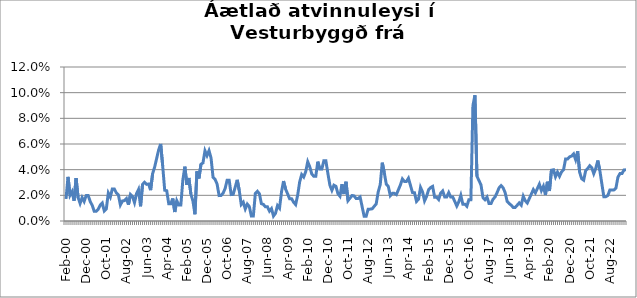
| Category | Series 0 |
|---|---|
| Feb-00 | 0.017 |
| Mar-00 | 0.034 |
| Apr-00 | 0.02 |
| May-00 | 0.023 |
| Jun-00 | 0.016 |
| Jul-00 | 0.033 |
| Aug-00 | 0.018 |
| Sep-00 | 0.014 |
| Oct-00 | 0.018 |
| Nov-00 | 0.015 |
| Dec-00 | 0.02 |
| Jan-01 | 0.02 |
| Feb-01 | 0.015 |
| Mar-01 | 0.012 |
| Apr-01 | 0.008 |
| May-01 | 0.008 |
| Jun-01 | 0.009 |
| Jul-01 | 0.012 |
| Aug-01 | 0.014 |
| Sep-01 | 0.008 |
| Oct-01 | 0.009 |
| Nov-01 | 0.022 |
| Dec-01 | 0.019 |
| Jan-02 | 0.025 |
| Feb-02 | 0.025 |
| Mar-02 | 0.022 |
| Apr-02 | 0.02 |
| May-02 | 0.012 |
| Jun-02 | 0.016 |
| Jul-02 | 0.016 |
| Aug-02 | 0.017 |
| Sep-02 | 0.013 |
| Oct-02 | 0.021 |
| Nov-02 | 0.019 |
| Dec-02 | 0.014 |
| Jan-03 | 0.021 |
| Feb-03 | 0.025 |
| Mar-03 | 0.011 |
| Apr-03 | 0.029 |
| May-03 | 0.03 |
| Jun-03 | 0.029 |
| Jul-03 | 0.029 |
| Aug-03 | 0.024 |
| Sep-03 | 0.037 |
| Oct-03 | 0.042 |
| Nov-03 | 0.049 |
| Dec-03 | 0.055 |
| Jan-04 | 0.06 |
| Feb-04 | 0.043 |
| Mar-04 | 0.024 |
| Apr-04 | 0.024 |
| May-04 | 0.013 |
| Jun-04 | 0.013 |
| Jul-04 | 0.018 |
| Aug-04 | 0.007 |
| Sep-04 | 0.016 |
| Oct-04 | 0.012 |
| Nov-04 | 0.012 |
| Dec-04 | 0.032 |
| Jan-05 | 0.042 |
| Feb-05 | 0.028 |
| Mar-05 | 0.034 |
| Apr-05 | 0.021 |
| May-05 | 0.016 |
| Jun-05 | 0.005 |
| Jul-05 | 0.039 |
| Aug-05 | 0.033 |
| Sep-05 | 0.044 |
| Oct-05 | 0.045 |
| Nov-05 | 0.055 |
| Dec-05 | 0.051 |
| Jan-06 | 0.055 |
| Feb-06 | 0.049 |
| Mar-06 | 0.034 |
| Apr-06 | 0.032 |
| May-06 | 0.029 |
| Jun-06 | 0.02 |
| Jul-06 | 0.02 |
| Aug-06 | 0.022 |
| Sep-06 | 0.025 |
| Oct-06 | 0.032 |
| Nov-06 | 0.032 |
| Dec-06 | 0.021 |
| Jan-07 | 0.021 |
| Feb-07 | 0.026 |
| Mar-07 | 0.032 |
| Apr-07 | 0.024 |
| May-07 | 0.013 |
| Jun-07 | 0.015 |
| Jul-07 | 0.009 |
| Aug-07 | 0.013 |
| Sep-07 | 0.011 |
| Oct-07 | 0.004 |
| Nov-07 | 0.004 |
| Dec-07 | 0.022 |
| Jan-08 | 0.023 |
| Feb-08 | 0.021 |
| Mar-08 | 0.014 |
| Apr-08 | 0.013 |
| May-08 | 0.011 |
| Jun-08 | 0.011 |
| Jul-08 | 0.008 |
| Aug-08 | 0.01 |
| Sep-08 | 0.004 |
| Oct-08 | 0.006 |
| Nov-08 | 0.012 |
| Dec-08 | 0.01 |
| Jan-09 | 0.023 |
| Feb-09 | 0.031 |
| Mar-09 | 0.025 |
| Apr-09 | 0.021 |
| May-09 | 0.017 |
| Jun-09 | 0.017 |
| Jul-09 | 0.015 |
| Aug-09 | 0.013 |
| Sep-09 | 0.02 |
| Oct-09 | 0.03 |
| Nov-09 | 0.036 |
| Dec-09 | 0.034 |
| Jan-10 | 0.038 |
| Feb-10 | 0.046 |
| Mar-10 | 0.042 |
| Apr-10 | 0.037 |
| May-10 | 0.035 |
| Jun-10 | 0.035 |
| Jul-10 | 0.046 |
| Aug-10 | 0.04 |
| Sep-10 | 0.04 |
| Oct-10 | 0.047 |
| Nov-10 | 0.047 |
| Dec-10 | 0.037 |
| Jan-11 | 0.028 |
| Feb-11 | 0.024 |
| Mar-11 | 0.028 |
| Apr-11 | 0.027 |
| May-11 | 0.021 |
| Jun-11 | 0.019 |
| Jul-11 | 0.029 |
| Aug-11 | 0.021 |
| Sep-11 | 0.031 |
| Oct-11 | 0.016 |
| Nov-11 | 0.018 |
| Dec-11 | 0.02 |
| Jan-12 | 0.02 |
| Feb-12 | 0.018 |
| Mar-12 | 0.018 |
| Apr-12 | 0.019 |
| May-12 | 0.011 |
| Jun-12 | 0.004 |
| Jul-12 | 0.004 |
| Aug-12 | 0.009 |
| Sep-12 | 0.009 |
| Oct-12 | 0.01 |
| Nov-12 | 0.011 |
| Dec-12 | 0.013 |
| Jan-13 | 0.023 |
| Feb-13 | 0.028 |
| Mar-13 | 0.045 |
| Apr-13 | 0.038 |
| May-13 | 0.029 |
| Jun-13 | 0.027 |
| Jul-13 | 0.02 |
| Aug-13 | 0.022 |
| Sep-13 | 0.022 |
| Oct-13 | 0.021 |
| Nov-13 | 0.024 |
| Dec-13 | 0.028 |
| jan..14 | 0.033 |
| Feb-14 | 0.031 |
| Mar-14 | 0.031 |
| Apr-14 | 0.033 |
| May-14 | 0.028 |
| Jun-14 | 0.022 |
| Jul-14 | 0.022 |
| Aug-14 | 0.015 |
| Sep-14 | 0.017 |
| Oct-14 | 0.026 |
| Nov-14 | 0.023 |
| Dec-14 | 0.016 |
| Jan-15 | 0.019 |
| Feb-15 | 0.024 |
| Mar-15 | 0.026 |
| Apr-15 | 0.027 |
| May-15 | 0.019 |
| Jun-15 | 0.019 |
| Jul-15 | 0.017 |
| Aug-15 | 0.022 |
| Sep-15 | 0.023 |
| Oct-15 | 0.019 |
| Nov-15 | 0.019 |
| Dec-15 | 0.022 |
| Jan-16 | 0.019 |
| Feb-16 | 0.019 |
| Mar-16 | 0.015 |
| Apr-16 | 0.012 |
| May-16 | 0.015 |
| Jun-16 | 0.02 |
| Jul-16 | 0.013 |
| Aug-16 | 0.013 |
| Sep-16 | 0.011 |
| Oct-16 | 0.017 |
| Nov-16 | 0.017 |
| Dec-16 | 0.09 |
| Jan-17 | 0.098 |
| Feb-17 | 0.035 |
| Mar-17 | 0.032 |
| Apr-17 | 0.028 |
| May-17 | 0.018 |
| Jun-17 | 0.017 |
| Jul-17 | 0.019 |
| Aug-17 | 0.014 |
| Sep-17 | 0.014 |
| Oct-17 | 0.017 |
| Nov-17 | 0.019 |
| Dec-17 | 0.022 |
| Jan-18 | 0.026 |
| Feb-18 | 0.028 |
| Mar-18 | 0.026 |
| Apr-18 | 0.022 |
| May-18 | 0.015 |
| Jun-18 | 0.014 |
| Jul-18 | 0.012 |
| Aug-18 | 0.011 |
| Sep-18 | 0.011 |
| Oct-18 | 0.012 |
| Nov-18 | 0.014 |
| Dec-18 | 0.012 |
| Jan-19 | 0.019 |
| Feb-19 | 0.016 |
| Mar-19 | 0.014 |
| Apr-19 | 0.017 |
| May-19 | 0.021 |
| Jun-19 | 0.024 |
| Jul-19 | 0.022 |
| Aug-19 | 0.025 |
| Sep-19 | 0.029 |
| Oct-19 | 0.024 |
| Nov-19 | 0.027 |
| Dec-19 | 0.02 |
| Jan-20 | 0.031 |
| Feb-20 | 0.023 |
| Mar-20 | 0.04 |
| Apr-20 | 0.04 |
| May-20 | 0.034 |
| Jun-20 | 0.038 |
| Jul-20 | 0.035 |
| Aug-20 | 0.038 |
| Sep-20 | 0.04 |
| Oct-20 | 0.048 |
| Nov-20 | 0.048 |
| Dec-20 | 0.05 |
| Jan-21 | 0.051 |
| Feb-21 | 0.052 |
| Mar-21 | 0.048 |
| Apr-21 | 0.054 |
| May-21 | 0.038 |
| Jun-21 | 0.033 |
| Jul-21 | 0.032 |
| Aug-21 | 0.039 |
| Sep-21 | 0.041 |
| Oct-21 | 0.043 |
| Nov-21 | 0.042 |
| Dec-21 | 0.037 |
| Jan-22 | 0.041 |
| Feb-22 | 0.047 |
| Mar-22 | 0.04 |
| Apr-22 | 0.029 |
| May-22 | 0.019 |
| Jun-22 | 0.019 |
| Jul-22 | 0.02 |
| Aug-22 | 0.024 |
| Sep-22 | 0.024 |
| Oct-22 | 0.024 |
| Nov-22 | 0.026 |
| Dec-22 | 0.034 |
| Jan-23 | 0.037 |
| Feb-23 | 0.037 |
| Mar-23 | 0.04 |
| Apr-23 | 0.04 |